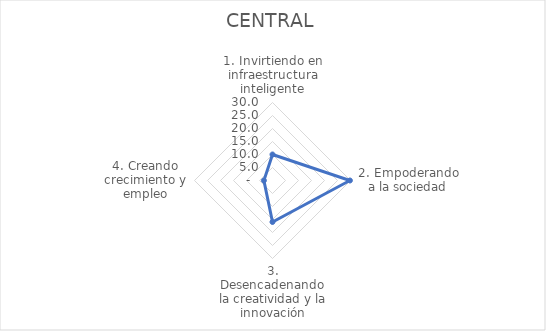
| Category | CENTRAL |
|---|---|
| 1. Invirtiendo en infraestructura inteligente | 10.006 |
| 2. Empoderando a la sociedad | 29.778 |
| 3. Desencadenando la creatividad y la innovación | 15.954 |
| 4. Creando crecimiento y empleo | 3.305 |